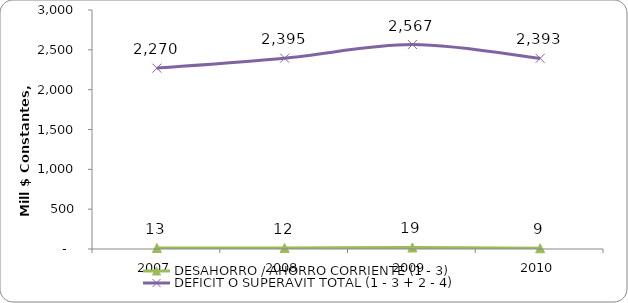
| Category | DESAHORRO / AHORRO CORRIENTE (1 - 3) | DEFICIT O SUPERAVIT TOTAL (1 - 3 + 2 - 4) |
|---|---|---|
| 2007 | 13.207 | 2270.117 |
| 2008 | 12.181 | 2395.321 |
| 2009 | 18.971 | 2566.768 |
| 2010 | 9.042 | 2393.238 |